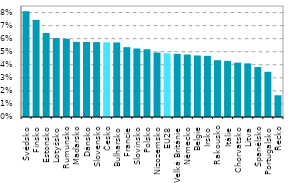
| Category | Series 0 |
|---|---|
| Švédsko | 0.081 |
| Finsko | 0.074 |
| Estonsko | 0.064 |
| Lotyšsko | 0.06 |
| Rumunsko | 0.06 |
| Maďarsko | 0.058 |
| Dánsko | 0.057 |
| Slovensko | 0.057 |
| Česko | 0.057 |
| Bulharsko | 0.057 |
| Francie | 0.054 |
| Slovinsko | 0.052 |
| Polsko | 0.052 |
| Nizozemsko | 0.049 |
| EU28 | 0.049 |
| Velká Británie | 0.048 |
| Německo | 0.048 |
| Belgie | 0.047 |
| Irsko | 0.047 |
| Rakousko | 0.043 |
| Itálie | 0.043 |
| Chorvatsko | 0.042 |
| Litva | 0.041 |
| Španělsko | 0.038 |
| Portugalsko | 0.035 |
| Řecko | 0.017 |